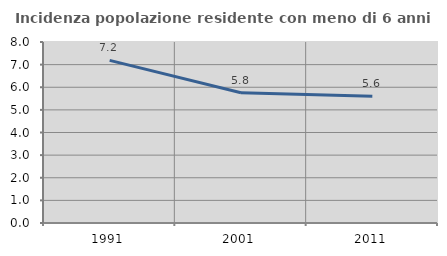
| Category | Incidenza popolazione residente con meno di 6 anni |
|---|---|
| 1991.0 | 7.188 |
| 2001.0 | 5.759 |
| 2011.0 | 5.606 |